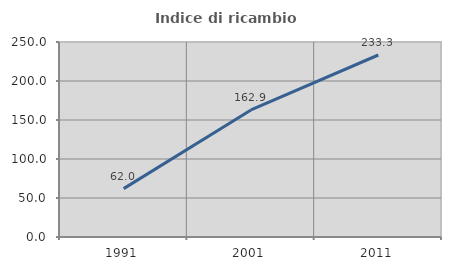
| Category | Indice di ricambio occupazionale  |
|---|---|
| 1991.0 | 62 |
| 2001.0 | 162.857 |
| 2011.0 | 233.333 |